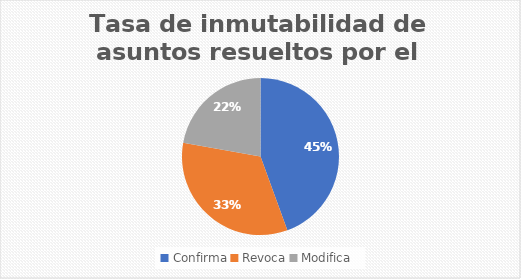
| Category | Tasa de inmutabilidad de asuntos resueltos por el TEPJF |
|---|---|
| Confirma | 4 |
| Revoca | 3 |
| Modifica | 2 |